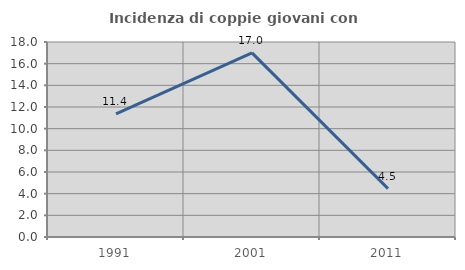
| Category | Incidenza di coppie giovani con figli |
|---|---|
| 1991.0 | 11.364 |
| 2001.0 | 16.993 |
| 2011.0 | 4.464 |